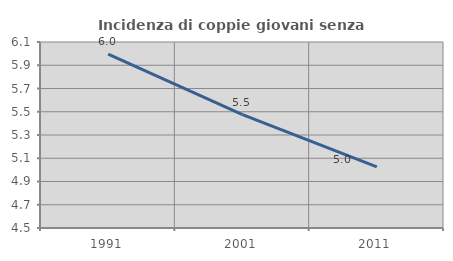
| Category | Incidenza di coppie giovani senza figli |
|---|---|
| 1991.0 | 5.995 |
| 2001.0 | 5.476 |
| 2011.0 | 5.026 |